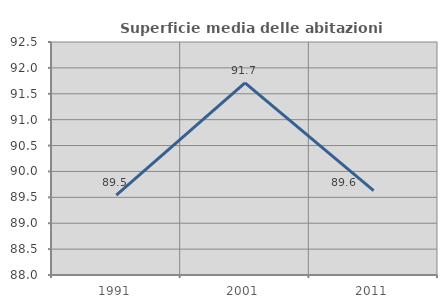
| Category | Superficie media delle abitazioni occupate |
|---|---|
| 1991.0 | 89.541 |
| 2001.0 | 91.709 |
| 2011.0 | 89.628 |